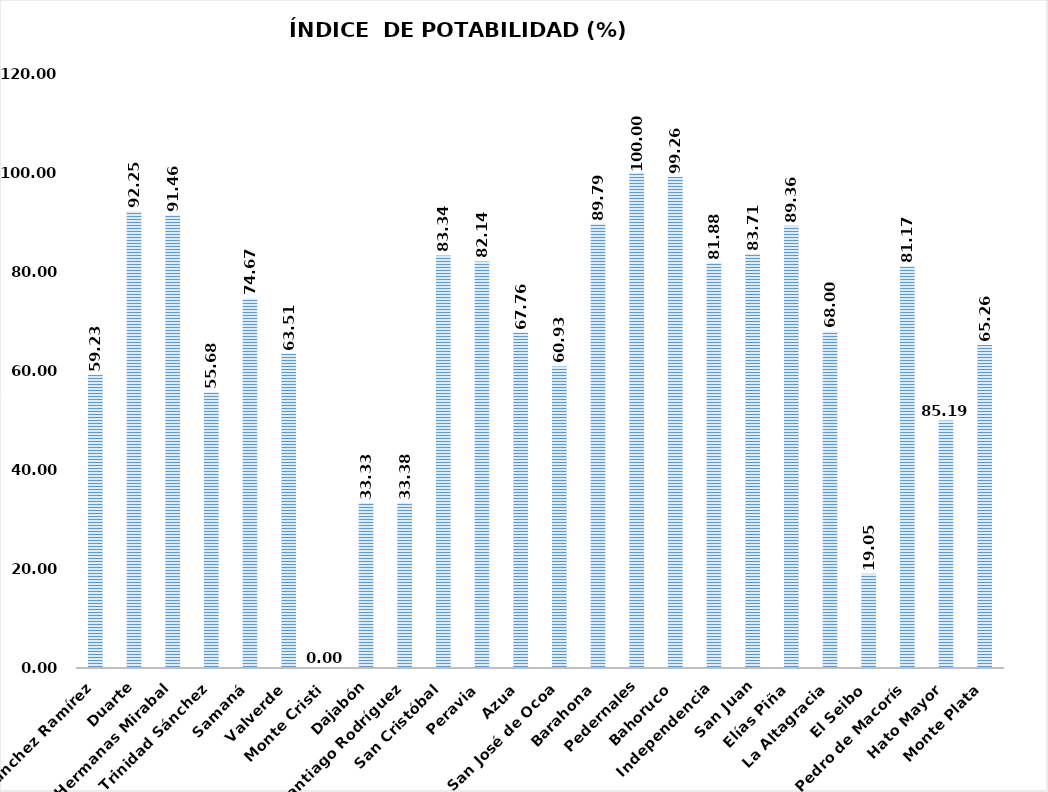
| Category | 59.23   |
|---|---|
| Sánchez Ramírez | 59.233 |
| Duarte | 92.25 |
| Hermanas Mirabal | 91.458 |
| María Trinidad Sánchez | 55.683 |
| Samaná | 74.671 |
| Valverde | 63.514 |
| Monte Cristi | 0 |
| Dajabón | 33.333 |
| Santiago Rodríguez | 33.385 |
| San Cristóbal | 83.339 |
| Peravia | 82.135 |
| Azua | 67.764 |
| San José de Ocoa | 60.929 |
| Barahona | 89.794 |
| Pedernales | 100 |
| Bahoruco | 99.259 |
| Independencia | 81.884 |
| San Juan | 83.71 |
| Elías Piña | 89.363 |
| La Altagracia | 68 |
| El Seibo | 19.05 |
| San Pedro de Macorís | 81.166 |
| Hato Mayor | 50 |
| Monte Plata | 65.263 |